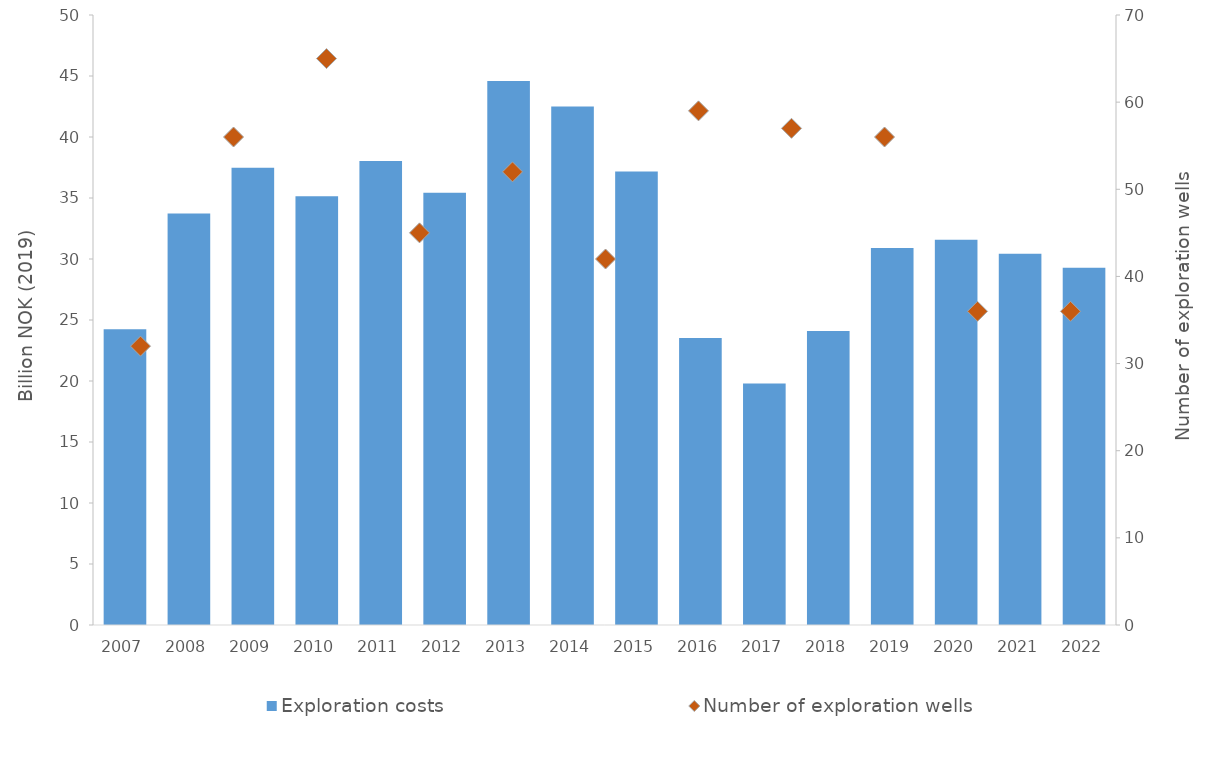
| Category | Exploration costs |
|---|---|
| 2007.0 | 24.235 |
| 2008.0 | 33.728 |
| 2009.0 | 37.489 |
| 2010.0 | 35.134 |
| 2011.0 | 38.031 |
| 2012.0 | 35.435 |
| 2013.0 | 44.6 |
| 2014.0 | 42.495 |
| 2015.0 | 37.171 |
| 2016.0 | 23.516 |
| 2017.0 | 19.792 |
| 2018.0 | 24.101 |
| 2019.0 | 30.904 |
| 2020.0 | 31.57 |
| 2021.0 | 30.44 |
| 2022.0 | 29.284 |